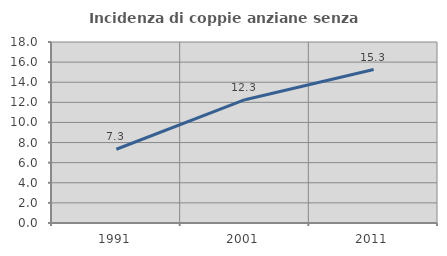
| Category | Incidenza di coppie anziane senza figli  |
|---|---|
| 1991.0 | 7.335 |
| 2001.0 | 12.261 |
| 2011.0 | 15.259 |